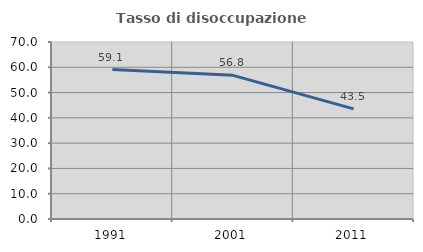
| Category | Tasso di disoccupazione giovanile  |
|---|---|
| 1991.0 | 59.124 |
| 2001.0 | 56.818 |
| 2011.0 | 43.548 |